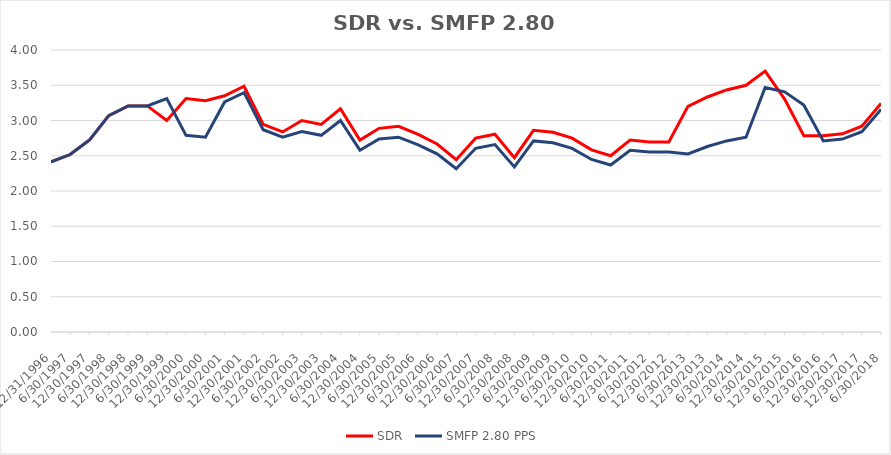
| Category | SDR | SMFP 2.80 PPS |
|---|---|---|
| 12/31/96 | 2.414 | 2.414 |
| 6/30/97 | 2.517 | 2.517 |
| 12/31/97 | 2.724 | 2.724 |
| 6/30/98 | 3.069 | 3.069 |
| 12/31/98 | 3.207 | 3.207 |
| 6/30/99 | 3.207 | 3.207 |
| 12/31/99 | 3 | 3.31 |
| 6/30/00 | 3.312 | 2.789 |
| 12/31/00 | 3.281 | 2.763 |
| 6/30/01 | 3.351 | 3.263 |
| 12/31/01 | 3.486 | 3.395 |
| 6/30/02 | 2.946 | 2.868 |
| 12/31/02 | 2.838 | 2.763 |
| 6/30/03 | 3 | 2.842 |
| 12/31/03 | 2.944 | 2.789 |
| 6/30/04 | 3.167 | 3 |
| 12/31/04 | 2.722 | 2.579 |
| 6/30/05 | 2.889 | 2.737 |
| 12/31/05 | 2.917 | 2.763 |
| 6/30/06 | 2.806 | 2.658 |
| 12/31/06 | 2.667 | 2.526 |
| 6/30/07 | 2.444 | 2.316 |
| 12/31/07 | 2.75 | 2.605 |
| 6/30/08 | 2.806 | 2.658 |
| 12/31/08 | 2.472 | 2.342 |
| 6/30/09 | 2.861 | 2.711 |
| 12/31/09 | 2.833 | 2.684 |
| 6/30/10 | 2.75 | 2.605 |
| 12/31/10 | 2.583 | 2.447 |
| 6/30/11 | 2.5 | 2.368 |
| 12/31/11 | 2.722 | 2.579 |
| 6/30/12 | 2.694 | 2.553 |
| 12/31/12 | 2.694 | 2.553 |
| 6/30/13 | 3.2 | 2.526 |
| 12/31/13 | 3.333 | 2.632 |
| 6/30/14 | 3.433 | 2.711 |
| 12/31/14 | 3.5 | 2.763 |
| 6/30/15 | 3.7 | 3.469 |
| 12/31/15 | 3.303 | 3.406 |
| 6/30/16 | 2.784 | 3.219 |
| 12/31/16 | 2.784 | 2.711 |
| 6/30/17 | 2.811 | 2.737 |
| 12/31/17 | 2.919 | 2.842 |
| 6/30/18 | 3.243 | 3.158 |